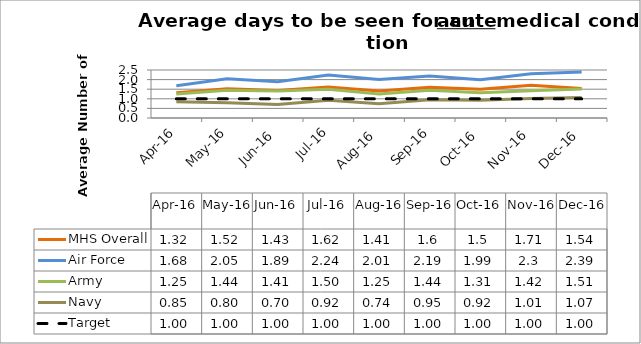
| Category | MHS Overall | Air Force | Army | Navy | Target |
|---|---|---|---|---|---|
| 2016-04-01 | 1.32 | 1.68 | 1.25 | 0.85 | 1 |
| 2016-05-01 | 1.52 | 2.05 | 1.44 | 0.8 | 1 |
| 2016-06-01 | 1.43 | 1.89 | 1.41 | 0.7 | 1 |
| 2016-07-01 | 1.62 | 2.24 | 1.5 | 0.92 | 1 |
| 2016-08-01 | 1.41 | 2.01 | 1.25 | 0.74 | 1 |
| 2016-09-01 | 1.6 | 2.19 | 1.44 | 0.95 | 1 |
| 2016-10-01 | 1.5 | 1.99 | 1.31 | 0.92 | 1 |
| 2016-11-01 | 1.71 | 2.3 | 1.42 | 1.01 | 1 |
| 2016-12-01 | 1.54 | 2.39 | 1.51 | 1.07 | 1 |